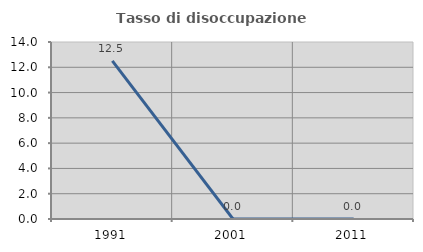
| Category | Tasso di disoccupazione giovanile  |
|---|---|
| 1991.0 | 12.5 |
| 2001.0 | 0 |
| 2011.0 | 0 |